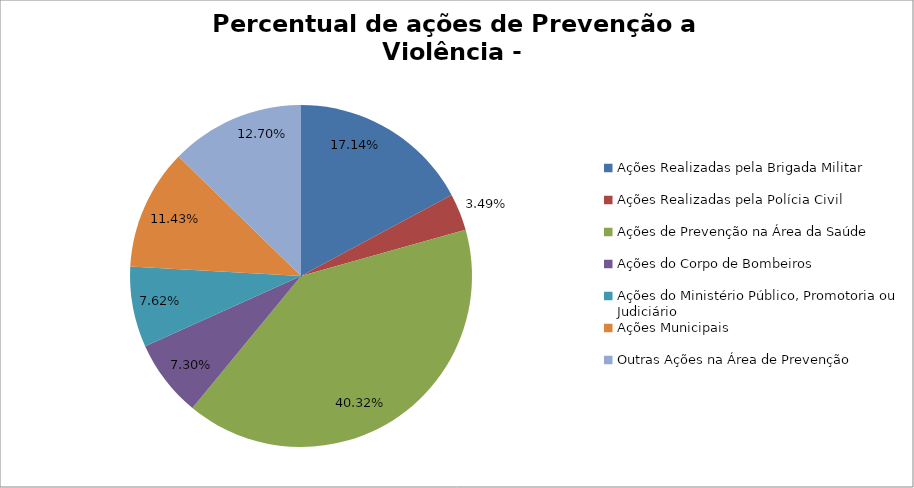
| Category | Percentual |
|---|---|
| Ações Realizadas pela Brigada Militar | 0.171 |
| Ações Realizadas pela Polícia Civil | 0.035 |
| Ações de Prevenção na Área da Saúde | 0.403 |
| Ações do Corpo de Bombeiros | 0.073 |
| Ações do Ministério Público, Promotoria ou Judiciário | 0.076 |
| Ações Municipais | 0.114 |
| Outras Ações na Área de Prevenção | 0.127 |